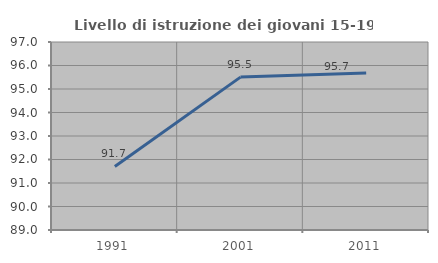
| Category | Livello di istruzione dei giovani 15-19 anni |
|---|---|
| 1991.0 | 91.703 |
| 2001.0 | 95.506 |
| 2011.0 | 95.676 |